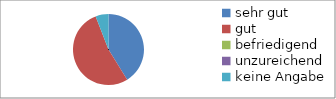
| Category | Series 0 |
|---|---|
| sehr gut | 7 |
| gut | 9 |
| befriedigend | 0 |
| unzureichend | 0 |
| keine Angabe | 1 |